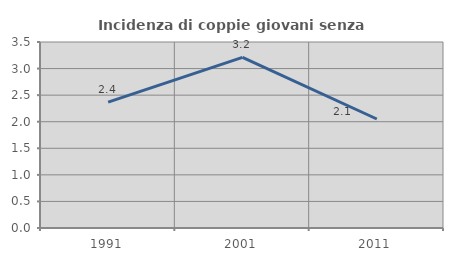
| Category | Incidenza di coppie giovani senza figli |
|---|---|
| 1991.0 | 2.368 |
| 2001.0 | 3.21 |
| 2011.0 | 2.051 |